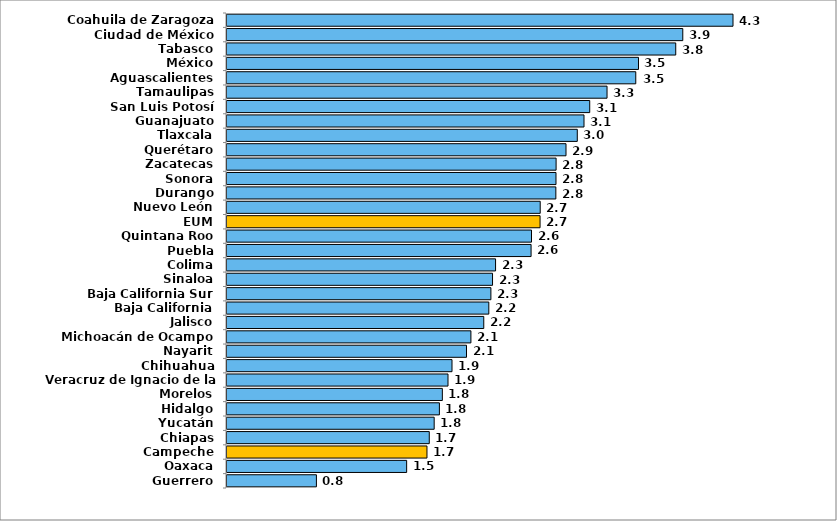
| Category | Series 0 |
|---|---|
| Coahuila de Zaragoza | 4.34 |
| Ciudad de México | 3.909 |
| Tabasco | 3.848 |
| México | 3.529 |
| Aguascalientes | 3.506 |
| Tamaulipas | 3.259 |
| San Luis Potosí | 3.111 |
| Guanajuato | 3.062 |
| Tlaxcala | 3.004 |
| Querétaro | 2.907 |
| Zacatecas | 2.822 |
| Sonora | 2.822 |
| Durango | 2.82 |
| Nuevo León | 2.686 |
| EUM | 2.685 |
| Quintana Roo | 2.612 |
| Puebla | 2.608 |
| Colima | 2.303 |
| Sinaloa | 2.277 |
| Baja California Sur | 2.263 |
| Baja California | 2.245 |
| Jalisco | 2.202 |
| Michoacán de Ocampo | 2.092 |
| Nayarit | 2.054 |
| Chihuahua | 1.93 |
| Veracruz de Ignacio de la Llave | 1.895 |
| Morelos | 1.847 |
| Hidalgo | 1.822 |
| Yucatán | 1.777 |
| Chiapas | 1.735 |
| Campeche | 1.715 |
| Oaxaca | 1.541 |
| Guerrero | 0.767 |